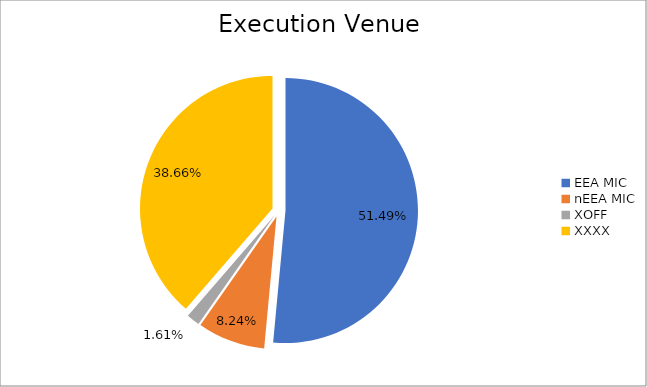
| Category | Series 0 |
|---|---|
| EEA MIC | 6468076.597 |
| nEEA MIC | 1035396.131 |
| XOFF | 202068.615 |
| XXXX | 4856613.604 |